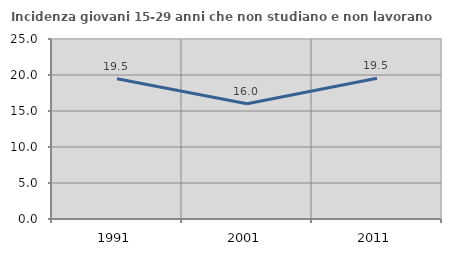
| Category | Incidenza giovani 15-29 anni che non studiano e non lavorano  |
|---|---|
| 1991.0 | 19.492 |
| 2001.0 | 16 |
| 2011.0 | 19.549 |